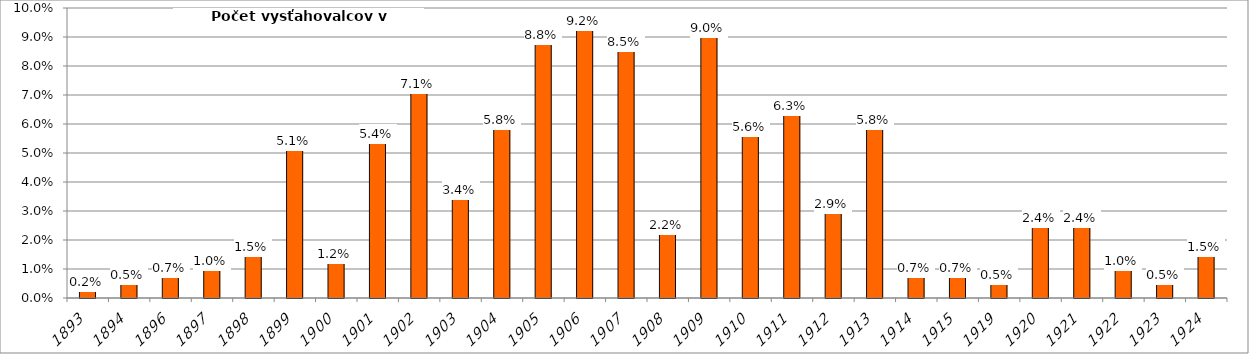
| Category | Počet vysťahovalcov v percentách. |
|---|---|
| 1893.0 | 0.243 |
| 1894.0 | 0.487 |
| 1896.0 | 0.73 |
| 1897.0 | 0.973 |
| 1898.0 | 1.46 |
| 1899.0 | 5.109 |
| 1900.0 | 1.217 |
| 1901.0 | 5.353 |
| 1902.0 | 7.056 |
| 1903.0 | 3.406 |
| 1904.0 | 5.839 |
| 1905.0 | 8.759 |
| 1906.0 | 9.246 |
| 1907.0 | 8.516 |
| 1908.0 | 2.19 |
| 1909.0 | 9.002 |
| 1910.0 | 5.596 |
| 1911.0 | 6.326 |
| 1912.0 | 2.92 |
| 1913.0 | 5.839 |
| 1914.0 | 0.73 |
| 1915.0 | 0.73 |
| 1919.0 | 0.487 |
| 1920.0 | 2.433 |
| 1921.0 | 2.433 |
| 1922.0 | 0.973 |
| 1923.0 | 0.487 |
| 1924.0 | 1.46 |